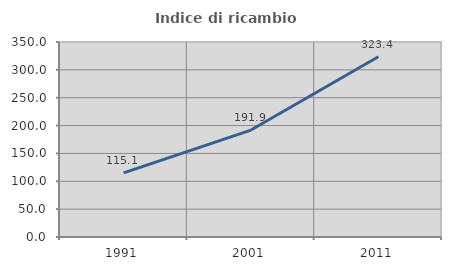
| Category | Indice di ricambio occupazionale  |
|---|---|
| 1991.0 | 115.075 |
| 2001.0 | 191.935 |
| 2011.0 | 323.404 |